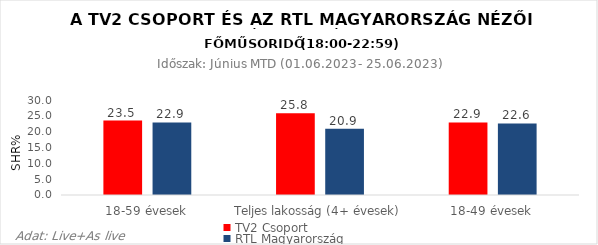
| Category | TV2 Csoport | RTL Magyarország |
|---|---|---|
| 18-59 évesek | 23.5 | 22.9 |
| Teljes lakosság (4+ évesek) | 25.8 | 20.9 |
| 18-49 évesek | 22.9 | 22.6 |